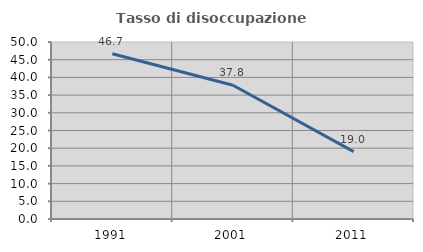
| Category | Tasso di disoccupazione giovanile  |
|---|---|
| 1991.0 | 46.667 |
| 2001.0 | 37.778 |
| 2011.0 | 19.048 |